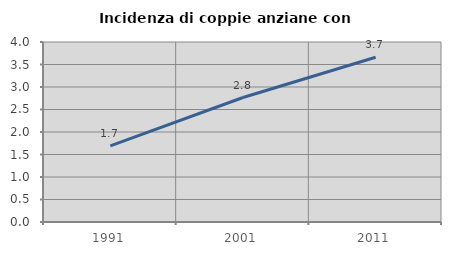
| Category | Incidenza di coppie anziane con figli |
|---|---|
| 1991.0 | 1.692 |
| 2001.0 | 2.767 |
| 2011.0 | 3.66 |